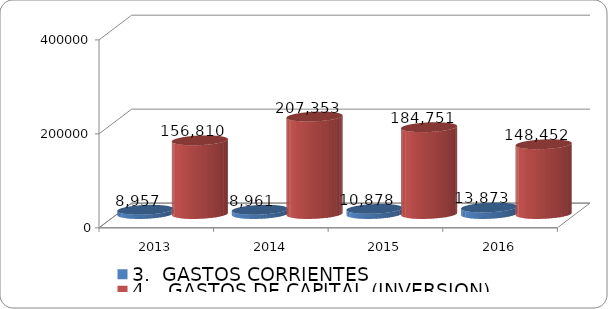
| Category | 3.  GASTOS CORRIENTES | 4.   GASTOS DE CAPITAL (INVERSION) |
|---|---|---|
| 2013.0 | 8956.752 | 156809.896 |
| 2014.0 | 8960.961 | 207353.083 |
| 2015.0 | 10877.89 | 184751.468 |
| 2016.0 | 13872.552 | 148451.719 |